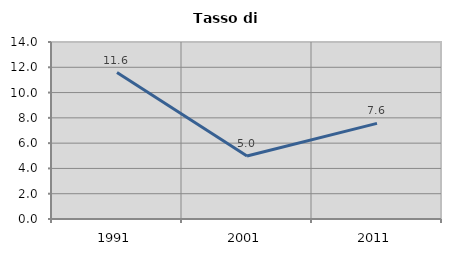
| Category | Tasso di disoccupazione   |
|---|---|
| 1991.0 | 11.581 |
| 2001.0 | 4.981 |
| 2011.0 | 7.565 |